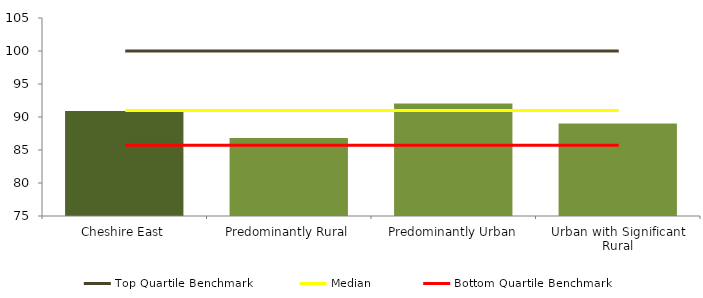
| Category | Series 0 |
|---|---|
| Cheshire East | 90.909 |
| Predominantly Rural | 86.817 |
| Predominantly Urban | 92.049 |
| Urban with Significant Rural | 89.016 |